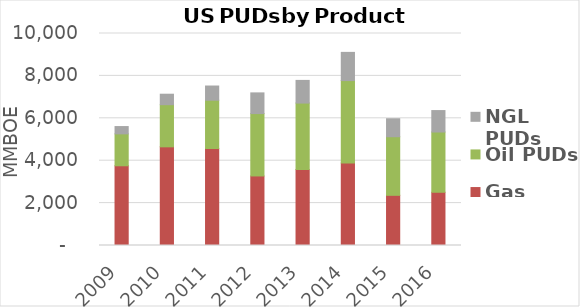
| Category | Gas PUDs | Oil PUDs | NGL PUDs |
|---|---|---|---|
| 2009 | 3760.638 | 1505.527 | 344.201 |
| 2010 | 4653.756 | 1988.84 | 493.745 |
| 2011 | 4574.864 | 2278.402 | 669.516 |
| 2012 | 3280.735 | 2941.794 | 976.367 |
| 2013 | 3582.567 | 3135.792 | 1069.379 |
| 2014 | 3885.692 | 3893.991 | 1329.488 |
| 2015 | 2366.88 | 2764.44 | 847.505 |
| 2016 | 2511.284 | 2842.252 | 1011.285 |